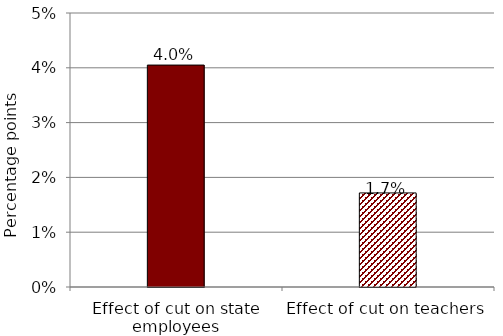
| Category | Series 0 |
|---|---|
| Effect of cut on state employees | 4.05 |
| Effect of cut on teachers | 1.716 |